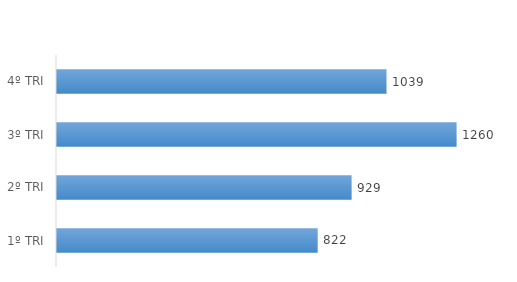
| Category | LESTE |
|---|---|
| 1º TRI | 822 |
| 2º TRI | 929 |
| 3º TRI | 1260 |
| 4º TRI | 1039 |